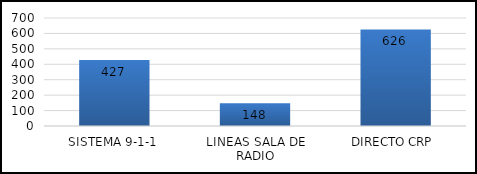
| Category | TOTAL |
|---|---|
| SISTEMA 9-1-1 | 427 |
| LINEAS SALA DE RADIO | 148 |
| DIRECTO CRP  | 626 |